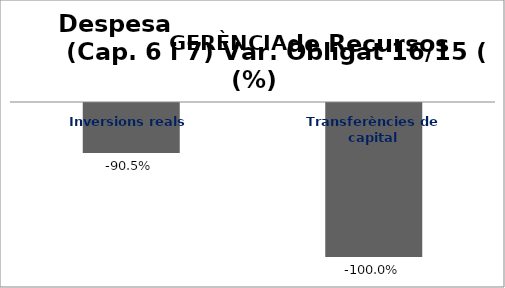
| Category | Series 0 |
|---|---|
| Inversions reals | -0.905 |
| Transferències de capital | -1 |